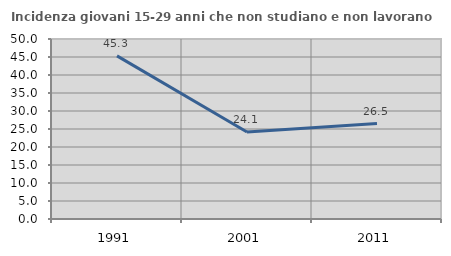
| Category | Incidenza giovani 15-29 anni che non studiano e non lavorano  |
|---|---|
| 1991.0 | 45.323 |
| 2001.0 | 24.146 |
| 2011.0 | 26.496 |